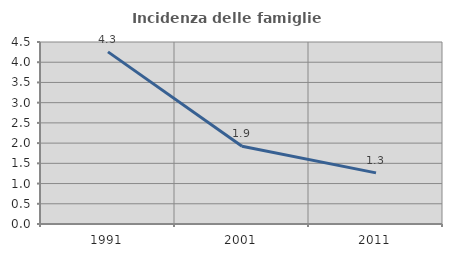
| Category | Incidenza delle famiglie numerose |
|---|---|
| 1991.0 | 4.256 |
| 2001.0 | 1.92 |
| 2011.0 | 1.264 |